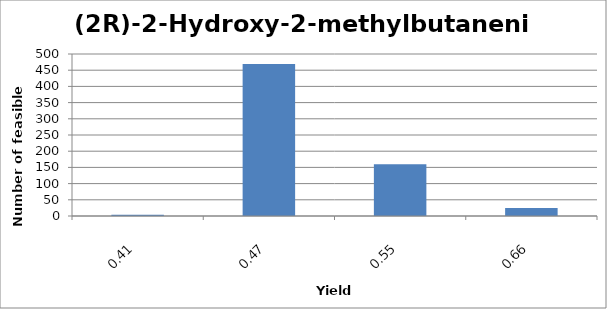
| Category | (2R)-2-Hydroxy-2-methylbutanenitrile |
|---|---|
| 0.4124 | 4 |
| 0.4714 | 469 |
| 0.5499 | 160 |
| 0.6599 | 25 |